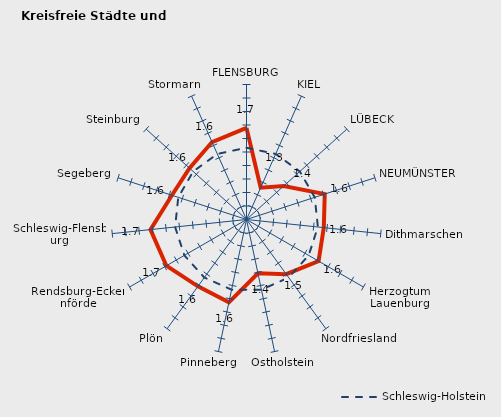
| Category | Kreise | Schleswig-Holstein |
|---|---|---|
| FLENSBURG | 1.679 | 1.532 |
| KIEL | 1.258 | 1.532 |
| LÜBECK | 1.37 | 1.532 |
| NEUMÜNSTER | 1.609 | 1.532 |
| Dithmarschen | 1.576 | 1.532 |
| Herzogtum Lauenburg | 1.617 | 1.532 |
| Nordfriesland | 1.5 | 1.532 |
| Ostholstein | 1.408 | 1.532 |
| Pinneberg | 1.628 | 1.532 |
| Plön | 1.612 | 1.532 |
| Rendsburg-Eckernförde | 1.685 | 1.532 |
| Schleswig-Flensburg | 1.715 | 1.532 |
| Segeberg | 1.581 | 1.532 |
| Steinburg | 1.568 | 1.532 |
| Stormarn | 1.628 | 1.532 |